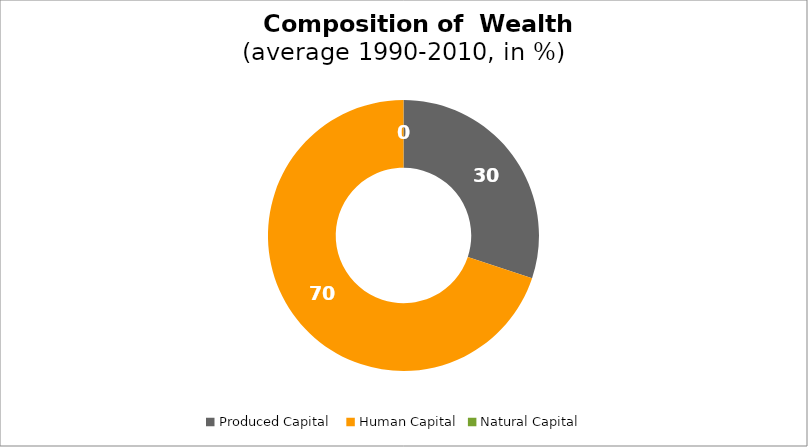
| Category | Series 0 |
|---|---|
| Produced Capital  | 30.111 |
| Human Capital | 69.885 |
| Natural Capital | 0.004 |